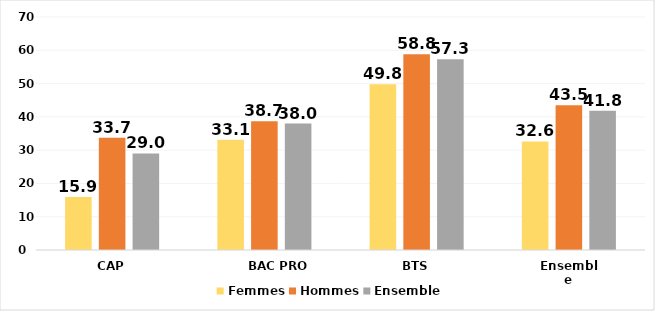
| Category | Femmes | Hommes | Ensemble |
|---|---|---|---|
| CAP | 15.9 | 33.7 | 29 |
| BAC PRO | 33.1 | 38.7 | 38 |
| BTS | 49.8 | 58.8 | 57.3 |
| Ensemble | 32.6 | 43.5 | 41.8 |